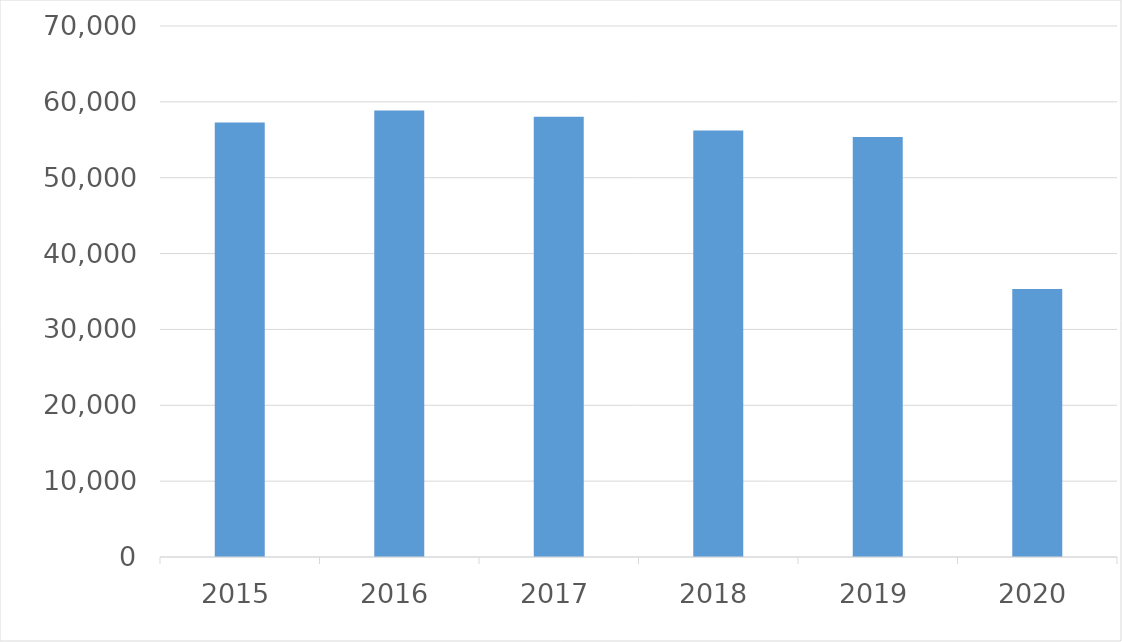
| Category | Series 0 |
|---|---|
| 2015 | 57272 |
| 2016 | 58861 |
| 2017 | 58025 |
| 2018 | 56231 |
| 2019 | 55353 |
| 2020 | 35315 |